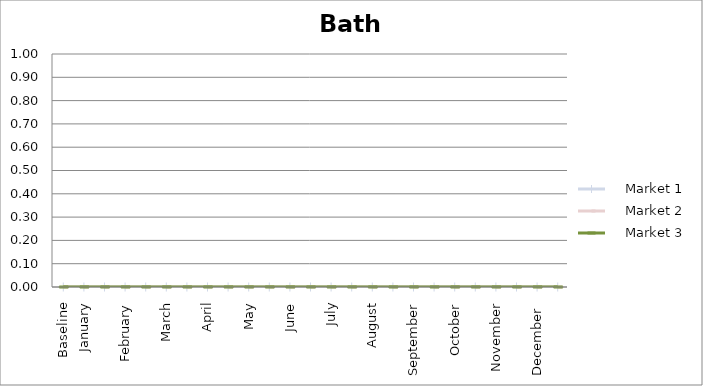
| Category |     Market 1 |     Market 2 |     Market 3 |
|---|---|---|---|
| Baseline | 0 | 0 | 0 |
| January | 0 | 0 | 0 |
|  | 0 | 0 | 0 |
| February | 0 | 0 | 0 |
|  | 0 | 0 | 0 |
| March | 0 | 0 | 0 |
|  | 0 | 0 | 0 |
| April | 0 | 0 | 0 |
|  | 0 | 0 | 0 |
| May | 0 | 0 | 0 |
|  | 0 | 0 | 0 |
| June | 0 | 0 | 0 |
|  | 0 | 0 | 0 |
| July | 0 | 0 | 0 |
|  | 0 | 0 | 0 |
| August | 0 | 0 | 0 |
|  | 0 | 0 | 0 |
| September | 0 | 0 | 0 |
|  | 0 | 0 | 0 |
| October | 0 | 0 | 0 |
|  | 0 | 0 | 0 |
| November | 0 | 0 | 0 |
|  | 0 | 0 | 0 |
| December  | 0 | 0 | 0 |